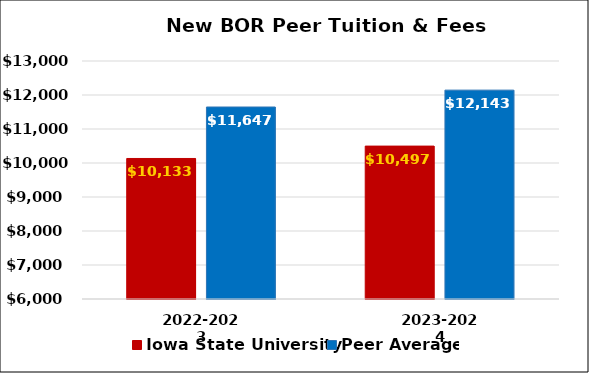
| Category | Iowa State University | Peer Average |
|---|---|---|
| 2022-2023 | 10133 | 11646.794 |
| 2023-2024 | 10497 | 12143 |